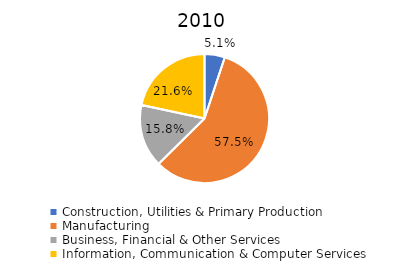
| Category | 2010 |
|---|---|
| Construction, Utilities & Primary Production  | 0.051 |
| Manufacturing  | 0.575 |
| Business, Financial & Other Services | 0.158 |
| Information, Communication & Computer Services | 0.216 |